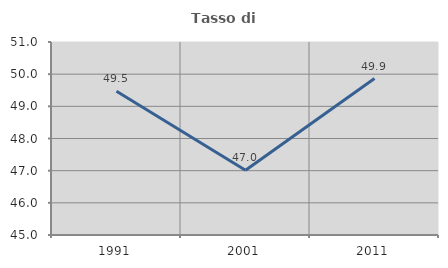
| Category | Tasso di occupazione   |
|---|---|
| 1991.0 | 49.468 |
| 2001.0 | 47.011 |
| 2011.0 | 49.863 |